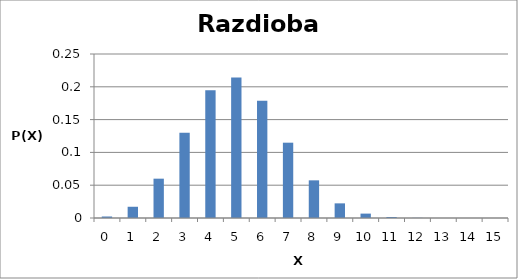
| Category | Series 0 |
|---|---|
| 0.0 | 0.002 |
| 1.0 | 0.017 |
| 2.0 | 0.06 |
| 3.0 | 0.13 |
| 4.0 | 0.195 |
| 5.0 | 0.214 |
| 6.0 | 0.179 |
| 7.0 | 0.115 |
| 8.0 | 0.057 |
| 9.0 | 0.022 |
| 10.0 | 0.007 |
| 11.0 | 0.002 |
| 12.0 | 0 |
| 13.0 | 0 |
| 14.0 | 0 |
| 15.0 | 0 |